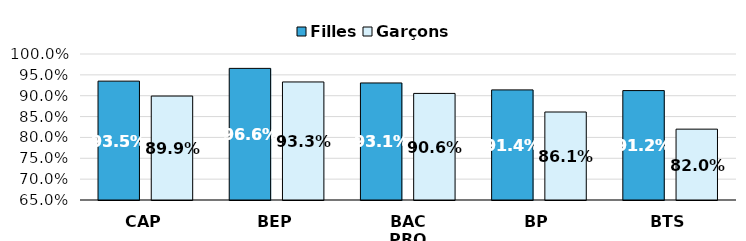
| Category | Filles | Garçons |
|---|---|---|
| CAP | 0.935 | 0.899 |
| BEP | 0.966 | 0.933 |
| BAC PRO | 0.931 | 0.906 |
| BP | 0.914 | 0.861 |
| BTS | 0.912 | 0.82 |